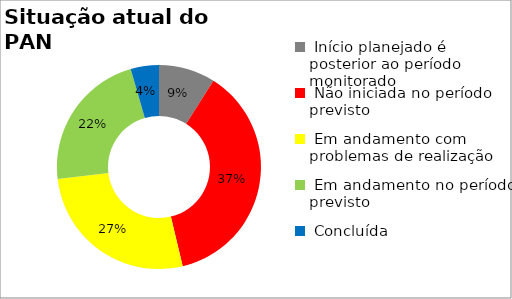
| Category | Series 0 |
|---|---|
|  Início planejado é posterior ao período monitorado | 0.09 |
|  Não iniciada no período previsto | 0.373 |
|  Em andamento com problemas de realização | 0.269 |
|  Em andamento no período previsto  | 0.224 |
|  Concluída | 0.045 |